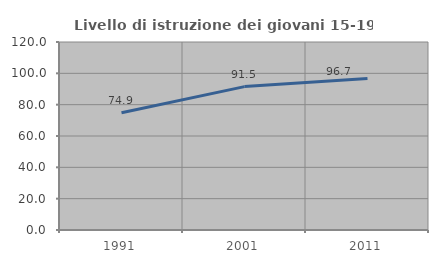
| Category | Livello di istruzione dei giovani 15-19 anni |
|---|---|
| 1991.0 | 74.875 |
| 2001.0 | 91.532 |
| 2011.0 | 96.668 |